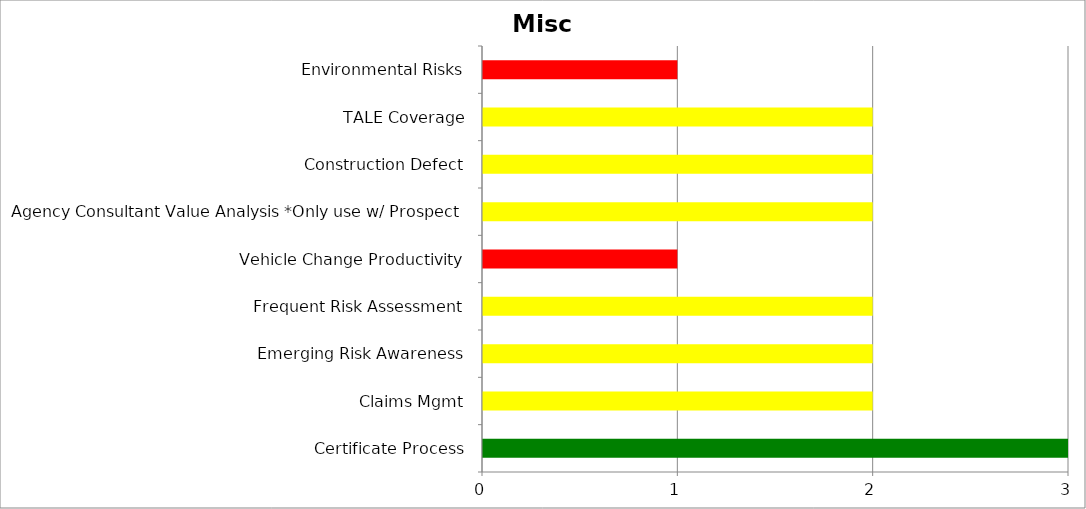
| Category | Low | Medium | High |
|---|---|---|---|
| Certificate Process | 3 | 0 | 0 |
| Claims Mgmt | 0 | 2 | 0 |
| Emerging Risk Awareness | 0 | 2 | 0 |
| Frequent Risk Assessment | 0 | 2 | 0 |
| Vehicle Change Productivity | 0 | 0 | 1 |
| Agency Consultant Value Analysis *Only use w/ Prospect | 0 | 2 | 0 |
| Construction Defect | 0 | 2 | 0 |
| TALE Coverage | 0 | 2 | 0 |
|  Environmental Risks | 0 | 0 | 1 |